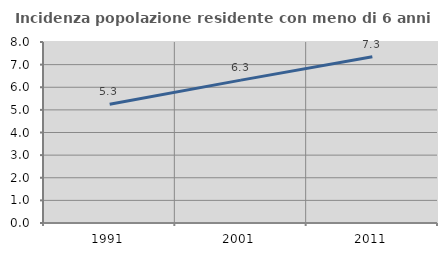
| Category | Incidenza popolazione residente con meno di 6 anni |
|---|---|
| 1991.0 | 5.252 |
| 2001.0 | 6.316 |
| 2011.0 | 7.344 |